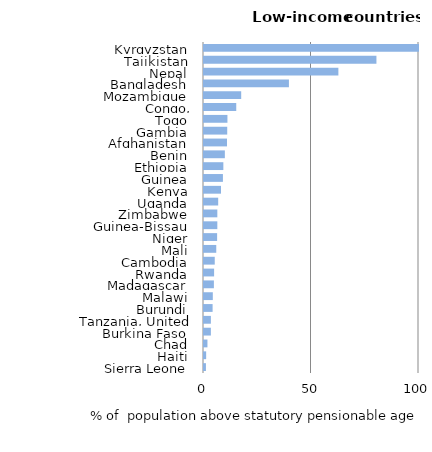
| Category | Series 0 |
|---|---|
| Sierra Leone | 0.9 |
| Haiti | 1 |
| Chad | 1.6 |
| Burkina Faso | 3.2 |
| Tanzania, United Rep. | 3.2 |
| Burundi | 4 |
| Malawi | 4.1 |
| Madagascar | 4.6 |
| Rwanda | 4.7 |
| Cambodia | 5 |
| Mali | 5.7 |
| Niger | 6.1 |
| Guinea-Bissau | 6.2 |
| Zimbabwe | 6.2 |
| Uganda | 6.6 |
| Kenya | 7.9 |
| Guinea | 8.8 |
| Ethiopia | 9 |
| Benin | 9.7 |
| Afghanistan | 10.7 |
| Gambia | 10.8 |
| Togo | 10.9 |
| Congo, Democratic Rep. | 15 |
| Mozambique | 17.3 |
| Bangladesh | 39.5 |
| Nepal | 62.5 |
| Tajikistan | 80.2 |
| Kyrgyzstan | 100 |